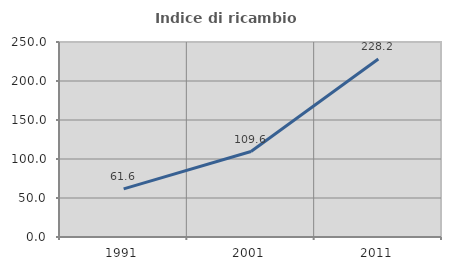
| Category | Indice di ricambio occupazionale  |
|---|---|
| 1991.0 | 61.627 |
| 2001.0 | 109.603 |
| 2011.0 | 228.155 |